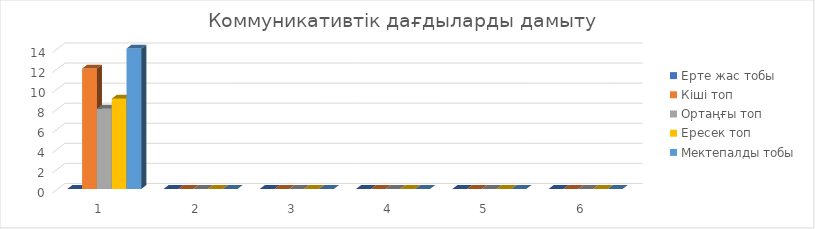
| Category | Ерте жас тобы  | Кіші топ | Ортаңғы топ | Ересек топ | Мектепалды тобы |
|---|---|---|---|---|---|
| 0 | 0 | 12 | 8 | 9 | 14 |
| 1 | 0 | 0 | 0 | 0 | 0 |
| 2 | 0 | 0 | 0 | 0 | 0 |
| 3 | 0 | 0 | 0 | 0 | 0 |
| 4 | 0 | 0 | 0 | 0 | 0 |
| 5 | 0 | 0 | 0 | 0 | 0 |